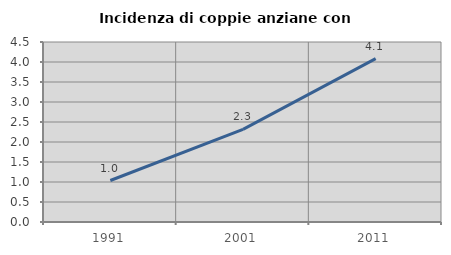
| Category | Incidenza di coppie anziane con figli |
|---|---|
| 1991.0 | 1.037 |
| 2001.0 | 2.316 |
| 2011.0 | 4.086 |